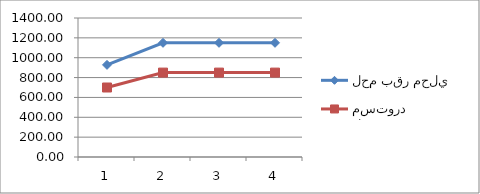
| Category | لحم بقر محلي | لحم بقر مجمد مستورد |
|---|---|---|
| 0 | 928 | 700 |
| 1 | 1150 | 850 |
| 2 | 1150 | 850 |
| 3 | 1150 | 850 |